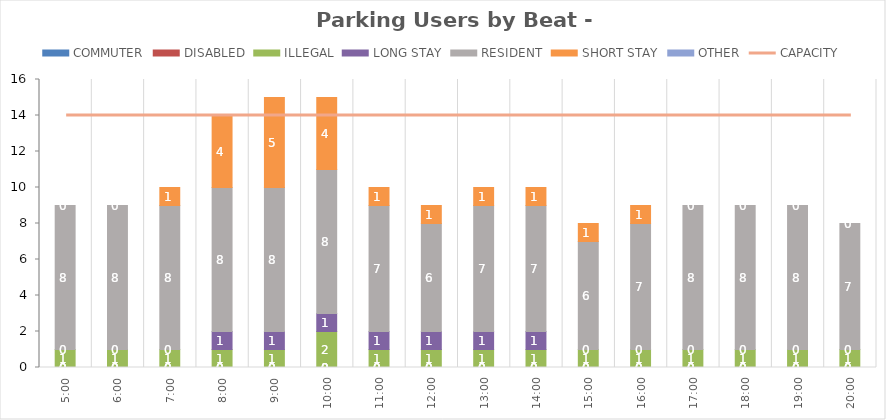
| Category | COMMUTER | DISABLED | ILLEGAL | LONG STAY | RESIDENT | SHORT STAY | OTHER |
|---|---|---|---|---|---|---|---|
| 0.20833333333333334 | 0 | 0 | 1 | 0 | 8 | 0 | 0 |
| 0.25 | 0 | 0 | 1 | 0 | 8 | 0 | 0 |
| 0.2916666666666667 | 0 | 0 | 1 | 0 | 8 | 1 | 0 |
| 0.3333333333333333 | 0 | 0 | 1 | 1 | 8 | 4 | 0 |
| 0.375 | 0 | 0 | 1 | 1 | 8 | 5 | 0 |
| 0.4166666666666667 | 0 | 0 | 2 | 1 | 8 | 4 | 0 |
| 0.4583333333333333 | 0 | 0 | 1 | 1 | 7 | 1 | 0 |
| 0.5 | 0 | 0 | 1 | 1 | 6 | 1 | 0 |
| 0.5416666666666666 | 0 | 0 | 1 | 1 | 7 | 1 | 0 |
| 0.5833333333333334 | 0 | 0 | 1 | 1 | 7 | 1 | 0 |
| 0.625 | 0 | 0 | 1 | 0 | 6 | 1 | 0 |
| 0.6666666666666666 | 0 | 0 | 1 | 0 | 7 | 1 | 0 |
| 0.7083333333333334 | 0 | 0 | 1 | 0 | 8 | 0 | 0 |
| 0.75 | 0 | 0 | 1 | 0 | 8 | 0 | 0 |
| 0.7916666666666666 | 0 | 0 | 1 | 0 | 8 | 0 | 0 |
| 0.8333333333333334 | 0 | 0 | 1 | 0 | 7 | 0 | 0 |